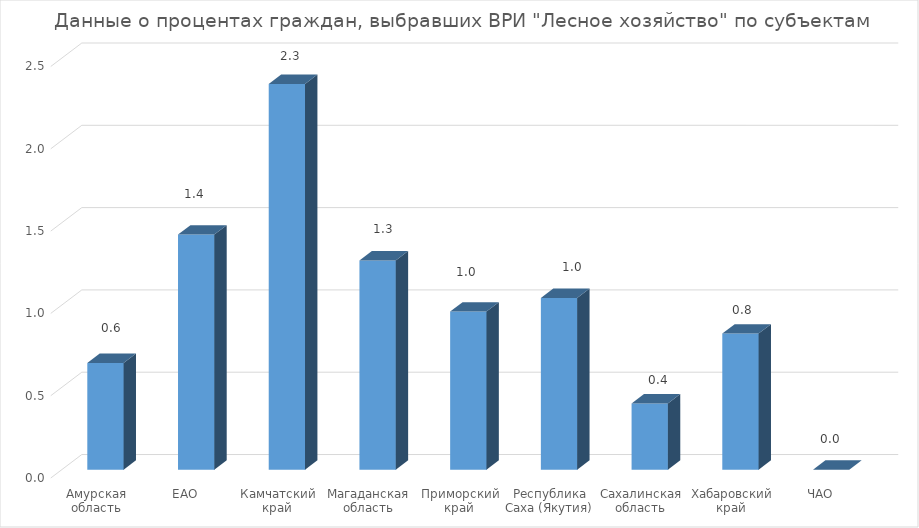
| Category | лесное хозяйство |
|---|---|
| Амурская область | 0.648 |
| ЕАО | 1.429 |
| Камчатский край | 2.344 |
| Магаданская область | 1.271 |
| Приморский край | 0.961 |
| Республика Саха (Якутия) | 1.044 |
| Сахалинская область | 0.402 |
| Хабаровский край | 0.827 |
| ЧАО | 0 |